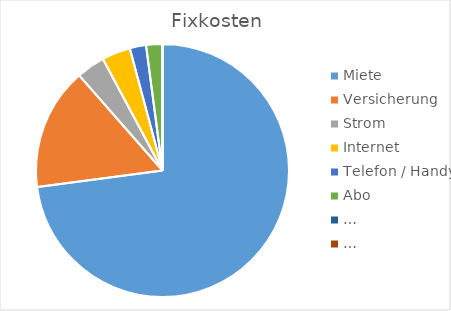
| Category | Fixkosten |
|---|---|
| Miete | 700 |
| Versicherung | 150 |
| Strom | 35 |
| Internet | 35 |
| Telefon / Handy | 20 |
| Abo | 20 |
| … | 0 |
| … | 0 |